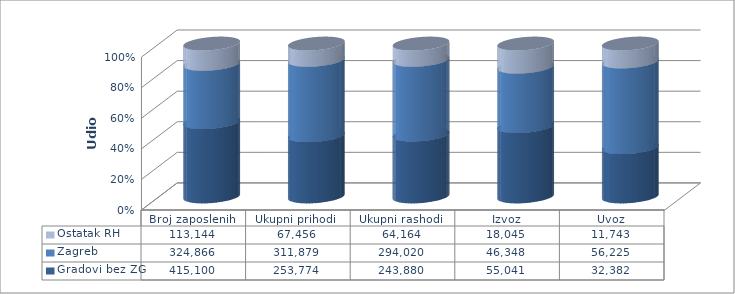
| Category | Gradovi bez ZG | Zagreb | Ostatak RH |
|---|---|---|---|
| Broj zaposlenih  | 415100 | 324866 | 113144 |
| Ukupni prihodi  | 253774 | 311879 | 67456 |
| Ukupni rashodi  | 243880 | 294020 | 64164 |
| Izvoz | 55041 | 46348 | 18045 |
| Uvoz | 32382 | 56225 | 11743 |